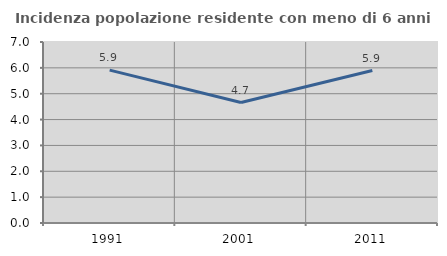
| Category | Incidenza popolazione residente con meno di 6 anni |
|---|---|
| 1991.0 | 5.913 |
| 2001.0 | 4.658 |
| 2011.0 | 5.896 |